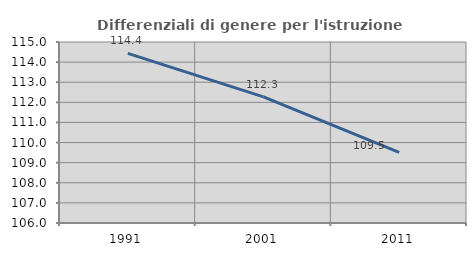
| Category | Differenziali di genere per l'istruzione superiore |
|---|---|
| 1991.0 | 114.431 |
| 2001.0 | 112.269 |
| 2011.0 | 109.509 |